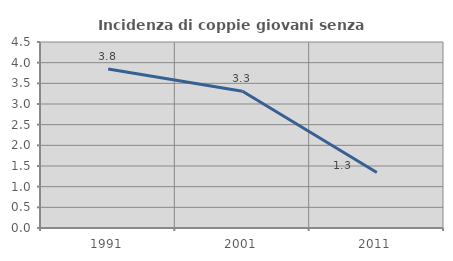
| Category | Incidenza di coppie giovani senza figli |
|---|---|
| 1991.0 | 3.846 |
| 2001.0 | 3.309 |
| 2011.0 | 1.342 |